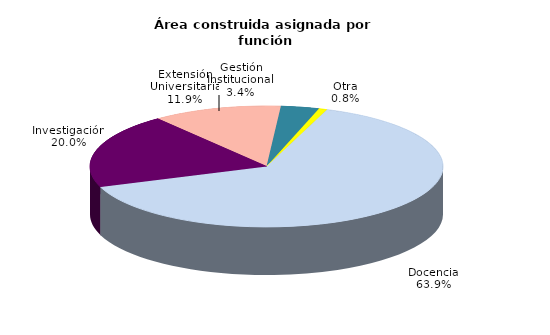
| Category | Series 0 |
|---|---|
| Docencia | 63.906 |
| Investigación | 19.964 |
| Extensión Universitaria | 11.871 |
| Gestión Institucional | 3.495 |
| Otra | 0.764 |